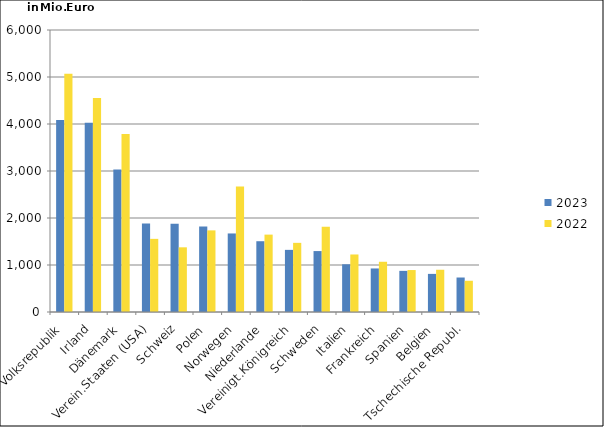
| Category | 2023 | 2022 |
|---|---|---|
| China, Volksrepublik | 4082.587 | 5069.967 |
| Irland | 4028.364 | 4554.171 |
| Dänemark | 3032.387 | 3786.051 |
| Verein.Staaten (USA) | 1880.75 | 1556.184 |
| Schweiz | 1878.836 | 1376.182 |
| Polen | 1818.639 | 1736.722 |
| Norwegen | 1671.032 | 2668.317 |
| Niederlande | 1505.896 | 1646.46 |
| Vereinigt.Königreich | 1321.97 | 1471.325 |
| Schweden | 1296.421 | 1816.026 |
| Italien | 1015.188 | 1223.841 |
| Frankreich | 926.45 | 1068.766 |
| Spanien | 875.329 | 892.72 |
| Belgien | 810.884 | 898.648 |
| Tschechische Republ. | 733.824 | 664.62 |